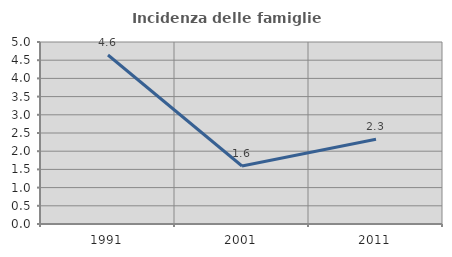
| Category | Incidenza delle famiglie numerose |
|---|---|
| 1991.0 | 4.643 |
| 2001.0 | 1.593 |
| 2011.0 | 2.33 |